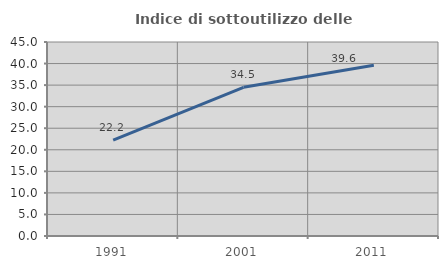
| Category | Indice di sottoutilizzo delle abitazioni  |
|---|---|
| 1991.0 | 22.222 |
| 2001.0 | 34.483 |
| 2011.0 | 39.623 |